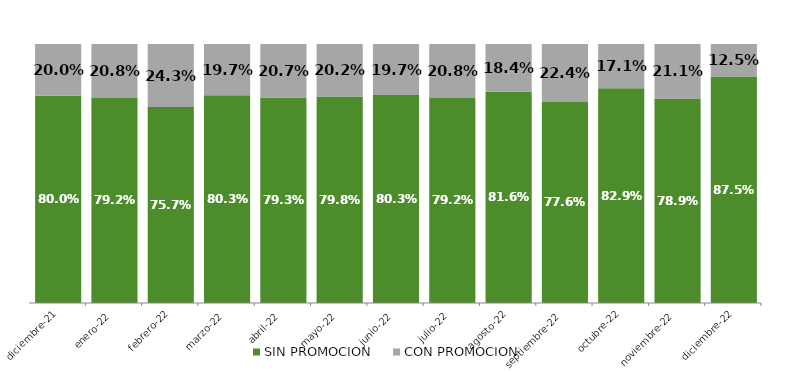
| Category | SIN PROMOCION   | CON PROMOCION   |
|---|---|---|
| 2021-12-01 | 0.8 | 0.2 |
| 2022-01-01 | 0.792 | 0.208 |
| 2022-02-01 | 0.757 | 0.243 |
| 2022-03-01 | 0.803 | 0.197 |
| 2022-04-01 | 0.793 | 0.207 |
| 2022-05-01 | 0.798 | 0.202 |
| 2022-06-01 | 0.803 | 0.197 |
| 2022-07-01 | 0.792 | 0.208 |
| 2022-08-01 | 0.816 | 0.184 |
| 2022-09-01 | 0.776 | 0.224 |
| 2022-10-01 | 0.829 | 0.171 |
| 2022-11-01 | 0.789 | 0.211 |
| 2022-12-01 | 0.875 | 0.125 |